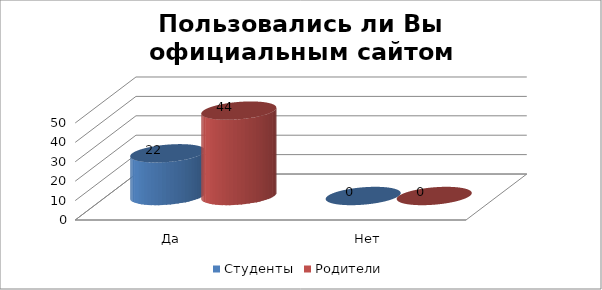
| Category | Студенты | Родители |
|---|---|---|
| Да | 22 | 44 |
| Нет | 0 | 0 |